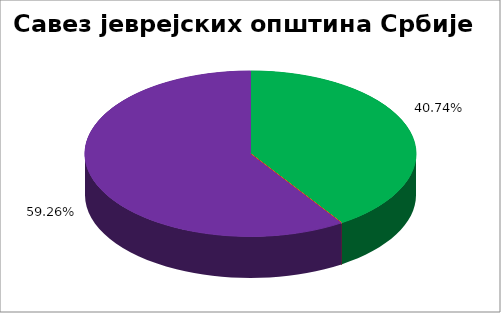
| Category | Савез јеврејских општина Србије |
|---|---|
| 0 | 0.407 |
| 1 | 0 |
| 2 | 0 |
| 3 | 0 |
| 4 | 0.593 |